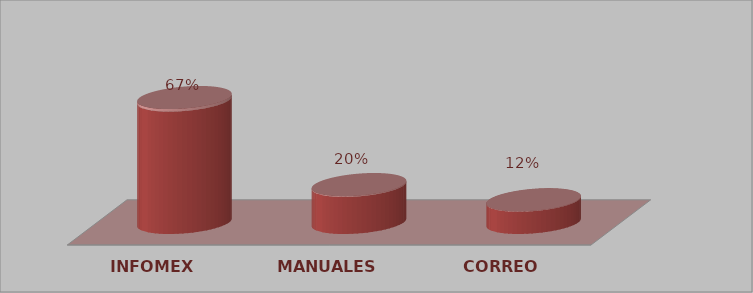
| Category | Series 0 | Series 1 |
|---|---|---|
| INFOMEX | 33 | 0.673 |
| MANUALES | 10 | 0.204 |
| CORREO | 6 | 0.122 |